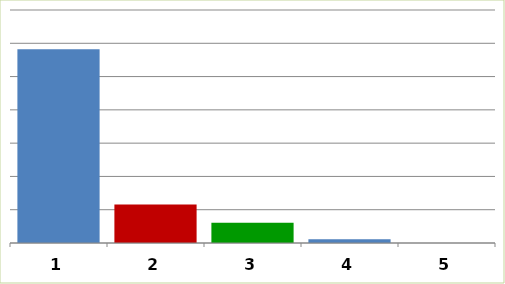
| Category | Series 0 |
|---|---|
| 0 | 291176280.59 |
| 1 | 57879292.24 |
| 2 | 30287757.09 |
| 3 | 5633191.98 |
| 4 | 0 |